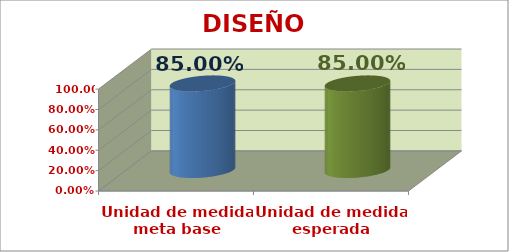
| Category | DISEÑO PEDAGÓGICO |
|---|---|
| Unidad de medida meta base | 0.85 |
| Unidad de medida esperada | 0.85 |